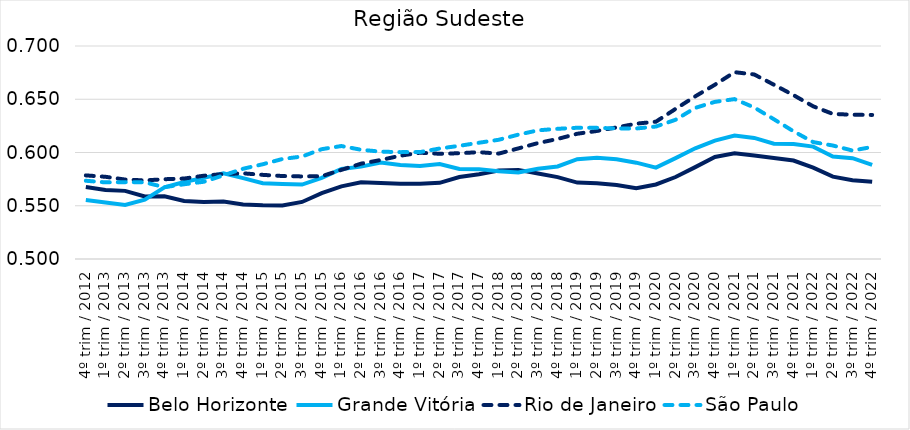
| Category | Belo Horizonte | Grande Vitória | Rio de Janeiro | São Paulo |
|---|---|---|---|---|
| 4º trim / 2012 | 0.568 | 0.555 | 0.579 | 0.573 |
| 1º trim / 2013 | 0.565 | 0.553 | 0.577 | 0.572 |
| 2º trim / 2013 | 0.564 | 0.551 | 0.575 | 0.572 |
| 3º trim / 2013 | 0.559 | 0.556 | 0.574 | 0.572 |
| 4º trim / 2013 | 0.559 | 0.567 | 0.575 | 0.567 |
| 1º trim / 2014 | 0.554 | 0.572 | 0.576 | 0.57 |
| 2º trim / 2014 | 0.554 | 0.576 | 0.578 | 0.573 |
| 3º trim / 2014 | 0.554 | 0.58 | 0.58 | 0.579 |
| 4º trim / 2014 | 0.551 | 0.576 | 0.58 | 0.585 |
| 1º trim / 2015 | 0.55 | 0.571 | 0.579 | 0.589 |
| 2º trim / 2015 | 0.55 | 0.57 | 0.578 | 0.594 |
| 3º trim / 2015 | 0.554 | 0.57 | 0.578 | 0.596 |
| 4º trim / 2015 | 0.562 | 0.576 | 0.578 | 0.603 |
| 1º trim / 2016 | 0.568 | 0.585 | 0.584 | 0.606 |
| 2º trim / 2016 | 0.572 | 0.587 | 0.59 | 0.603 |
| 3º trim / 2016 | 0.571 | 0.591 | 0.593 | 0.601 |
| 4º trim / 2016 | 0.571 | 0.588 | 0.597 | 0.6 |
| 1º trim / 2017 | 0.571 | 0.587 | 0.6 | 0.6 |
| 2º trim / 2017 | 0.571 | 0.589 | 0.599 | 0.604 |
| 3º trim / 2017 | 0.577 | 0.584 | 0.599 | 0.606 |
| 4º trim / 2017 | 0.58 | 0.584 | 0.6 | 0.609 |
| 1º trim / 2018 | 0.583 | 0.582 | 0.599 | 0.612 |
| 2º trim / 2018 | 0.584 | 0.581 | 0.604 | 0.617 |
| 3º trim / 2018 | 0.58 | 0.585 | 0.609 | 0.621 |
| 4º trim / 2018 | 0.577 | 0.587 | 0.613 | 0.622 |
| 1º trim / 2019 | 0.572 | 0.594 | 0.618 | 0.623 |
| 2º trim / 2019 | 0.571 | 0.595 | 0.62 | 0.623 |
| 3º trim / 2019 | 0.57 | 0.594 | 0.624 | 0.623 |
| 4º trim / 2019 | 0.566 | 0.59 | 0.627 | 0.623 |
| 1º trim / 2020 | 0.57 | 0.586 | 0.629 | 0.624 |
| 2º trim / 2020 | 0.577 | 0.595 | 0.641 | 0.631 |
| 3º trim / 2020 | 0.586 | 0.604 | 0.653 | 0.642 |
| 4º trim / 2020 | 0.596 | 0.611 | 0.664 | 0.648 |
| 1º trim / 2021 | 0.599 | 0.616 | 0.675 | 0.65 |
| 2º trim / 2021 | 0.597 | 0.614 | 0.673 | 0.642 |
| 3º trim / 2021 | 0.595 | 0.608 | 0.664 | 0.631 |
| 4º trim / 2021 | 0.592 | 0.608 | 0.654 | 0.62 |
| 1º trim / 2022 | 0.586 | 0.606 | 0.643 | 0.61 |
| 2º trim / 2022 | 0.577 | 0.596 | 0.636 | 0.607 |
| 3º trim / 2022 | 0.574 | 0.595 | 0.635 | 0.602 |
| 4º trim / 2022 | 0.573 | 0.588 | 0.635 | 0.605 |